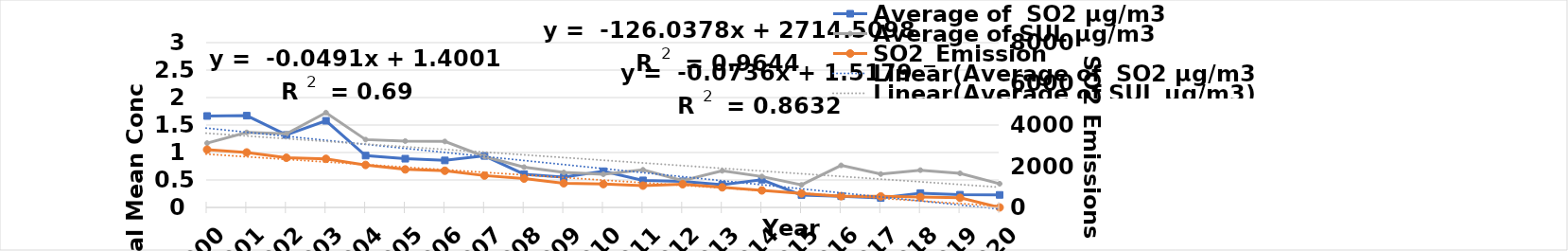
| Category | Average of  SO2 µg/m3 | Average of SUL µg/m3 |
|---|---|---|
| 2000.0 | 1.664 | 1.171 |
| 2001.0 | 1.671 | 1.366 |
| 2002.0 | 1.32 | 1.34 |
| 2003.0 | 1.577 | 1.726 |
| 2004.0 | 0.944 | 1.235 |
| 2005.0 | 0.887 | 1.208 |
| 2006.0 | 0.856 | 1.201 |
| 2007.0 | 0.938 | 0.927 |
| 2008.0 | 0.605 | 0.734 |
| 2009.0 | 0.55 | 0.636 |
| 2010.0 | 0.659 | 0.604 |
| 2011.0 | 0.492 | 0.685 |
| 2012.0 | 0.476 | 0.489 |
| 2013.0 | 0.416 | 0.667 |
| 2014.0 | 0.504 | 0.563 |
| 2015.0 | 0.226 | 0.41 |
| 2016.0 | 0.205 | 0.765 |
| 2017.0 | 0.173 | 0.607 |
| 2018.0 | 0.261 | 0.679 |
| 2019.0 | 0.231 | 0.621 |
| 2020.0 | 0.228 | 0.431 |